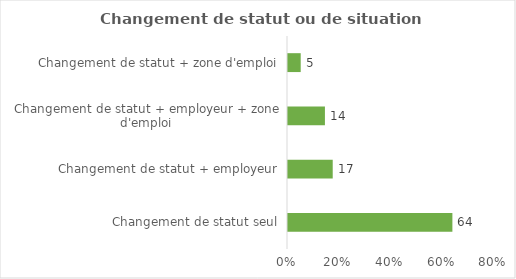
| Category | Series 0 |
|---|---|
| Changement de statut seul | 63.533 |
| Changement de statut + employeur | 17.284 |
| Changement de statut + employeur + zone d'emploi | 14.273 |
| Changement de statut + zone d'emploi | 4.91 |